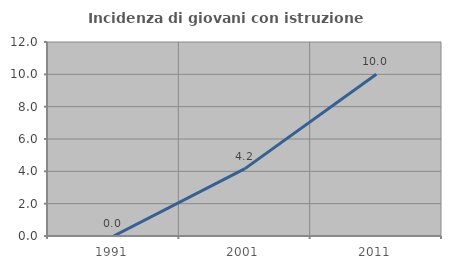
| Category | Incidenza di giovani con istruzione universitaria |
|---|---|
| 1991.0 | 0 |
| 2001.0 | 4.167 |
| 2011.0 | 10 |